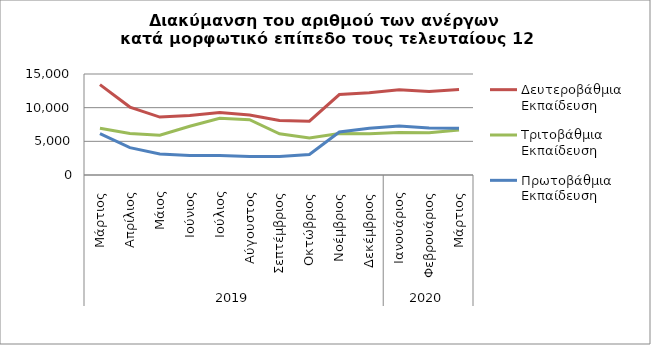
| Category | Δευτεροβάθμια Εκπαίδευση | Τριτοβάθμια Εκπαίδευση | Πρωτοβάθμια Εκπαίδευση |
|---|---|---|---|
| 0 | 13419 | 6931 | 6158 |
| 1 | 10088 | 6160 | 4067 |
| 2 | 8603 | 5896 | 3108 |
| 3 | 8822 | 7231 | 2907 |
| 4 | 9270 | 8411 | 2901 |
| 5 | 8918 | 8210 | 2755 |
| 6 | 8096 | 6115 | 2757 |
| 7 | 7999 | 5505 | 3040 |
| 8 | 11945 | 6155 | 6395 |
| 9 | 12223 | 6111 | 6951 |
| 10 | 12645 | 6303 | 7266 |
| 11 | 12391 | 6258 | 6971 |
| 12 | 12702 | 6691 | 6960 |